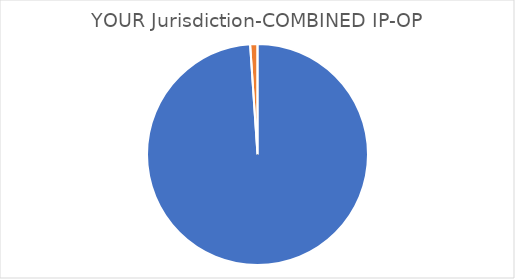
| Category | YOUR Jurisdiction-COMBINED IP-OP |
|---|---|
| 0 | 13625649 |
| 1 | 146720 |